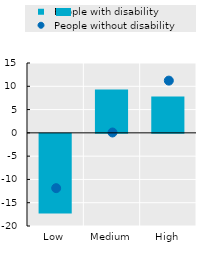
| Category |   People with disability |
|---|---|
| Low | -17.09 |
| Medium | 9.306 |
| High | 7.784 |